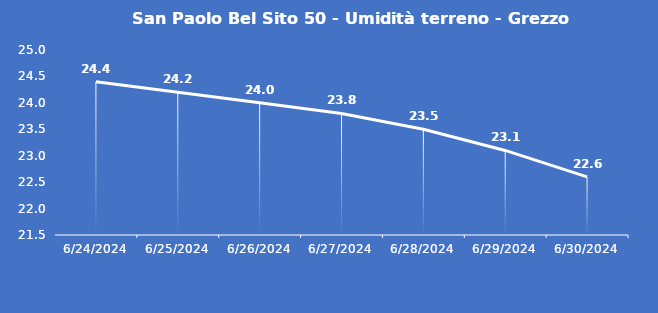
| Category | San Paolo Bel Sito 50 - Umidità terreno - Grezzo (%VWC) |
|---|---|
| 6/24/24 | 24.4 |
| 6/25/24 | 24.2 |
| 6/26/24 | 24 |
| 6/27/24 | 23.8 |
| 6/28/24 | 23.5 |
| 6/29/24 | 23.1 |
| 6/30/24 | 22.6 |